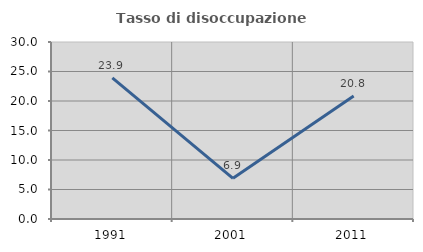
| Category | Tasso di disoccupazione giovanile  |
|---|---|
| 1991.0 | 23.913 |
| 2001.0 | 6.897 |
| 2011.0 | 20.833 |